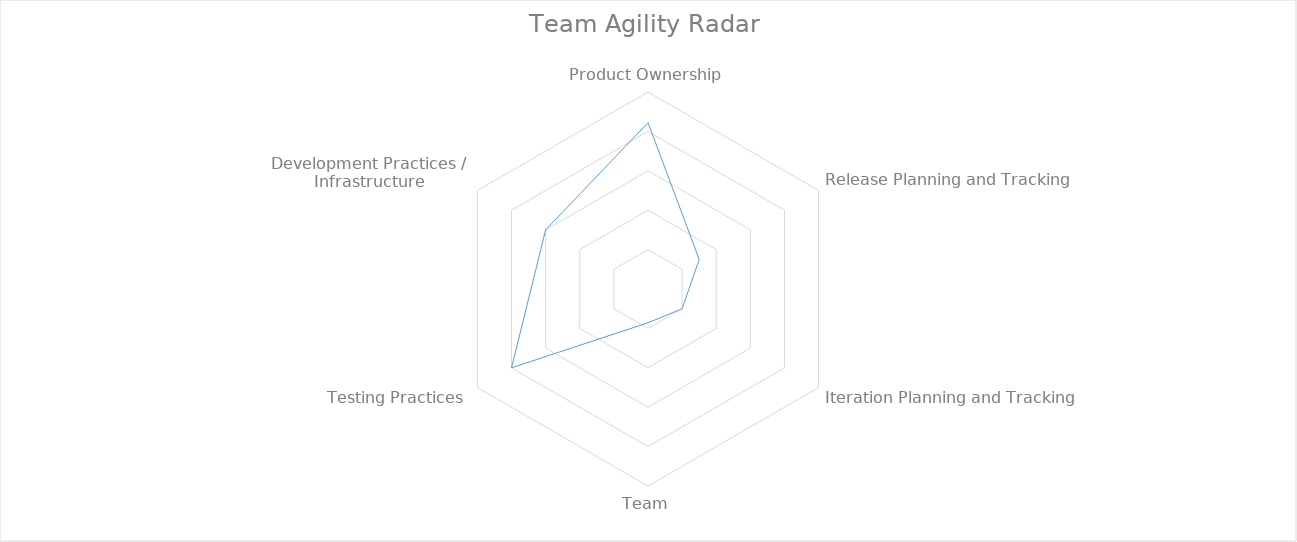
| Category | Series 0 |
|---|---|
| Product Ownership | 4.222 |
| Release Planning and Tracking | 1.5 |
| Iteration Planning and Tracking | 1 |
| Team | 0.857 |
| Testing Practices | 4 |
| Development Practices / Infrastructure | 3 |